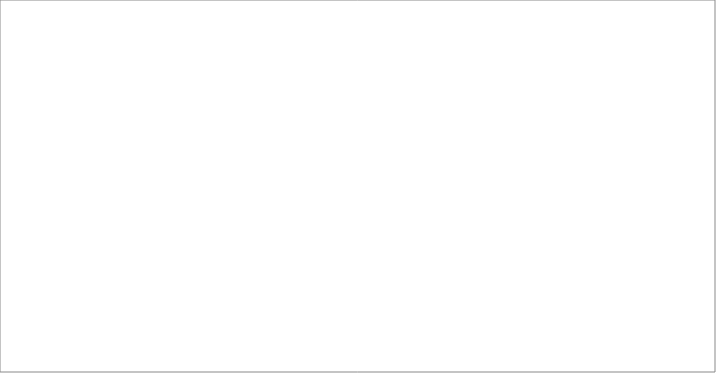
| Category | 2004 | 2005 | 2006 | 2008 | 2009 | 2010 | 2011 | 2012 | 2013 |
|---|---|---|---|---|---|---|---|---|---|
| Afganistan | 2 | 3 | 0 | 1 | 0 | 1 | 4 | 4 | 14 |